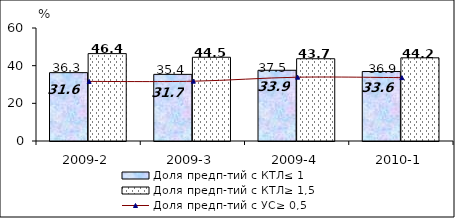
| Category | Доля предп-тий с КТЛ≤ 1 | Доля предп-тий с КТЛ≥ 1,5 |
|---|---|---|
| 2009-2 | 36.293 | 46.397 |
| 2009-3 | 35.38 | 44.464 |
| 2009-4 | 37.55 | 43.675 |
| 2010-1 | 36.906 | 44.162 |